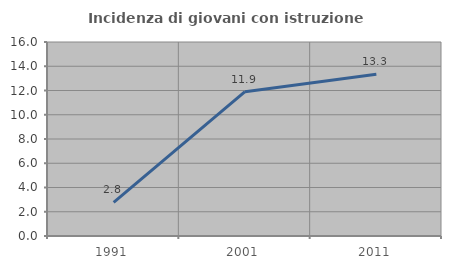
| Category | Incidenza di giovani con istruzione universitaria |
|---|---|
| 1991.0 | 2.778 |
| 2001.0 | 11.905 |
| 2011.0 | 13.333 |